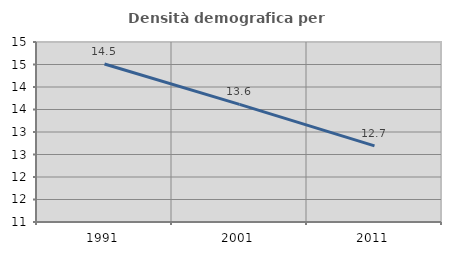
| Category | Densità demografica |
|---|---|
| 1991.0 | 14.51 |
| 2001.0 | 13.615 |
| 2011.0 | 12.693 |